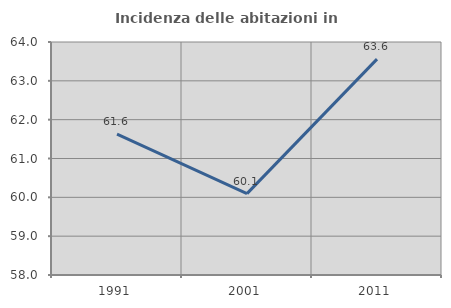
| Category | Incidenza delle abitazioni in proprietà  |
|---|---|
| 1991.0 | 61.626 |
| 2001.0 | 60.096 |
| 2011.0 | 63.56 |